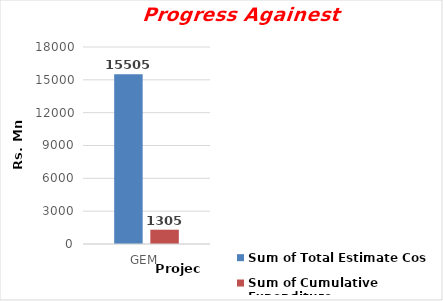
| Category | Sum of Total Estimate Cost | Sum of Cumulative Expenditure  |
|---|---|---|
| GEM | 15505 | 1305 |